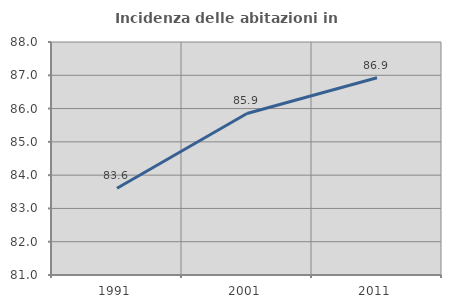
| Category | Incidenza delle abitazioni in proprietà  |
|---|---|
| 1991.0 | 83.608 |
| 2001.0 | 85.853 |
| 2011.0 | 86.924 |